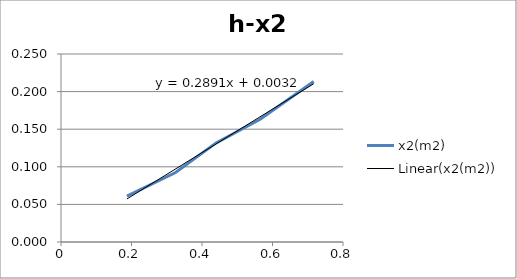
| Category | x2(m2) |
|---|---|
| 0.187 | 0.061 |
| 0.325 | 0.092 |
| 0.44 | 0.132 |
| 0.565 | 0.163 |
| 0.717 | 0.213 |